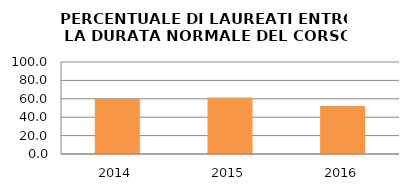
| Category | 2014 2015 2016 |
|---|---|
| 2014.0 | 60 |
| 2015.0 | 61.538 |
| 2016.0 | 52.174 |